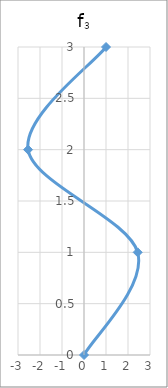
| Category | f3 |
|---|---|
| 0.0 | 0 |
| 2.439627521532507 | 1 |
| -2.541936179719772 | 2 |
| 1.0 | 3 |